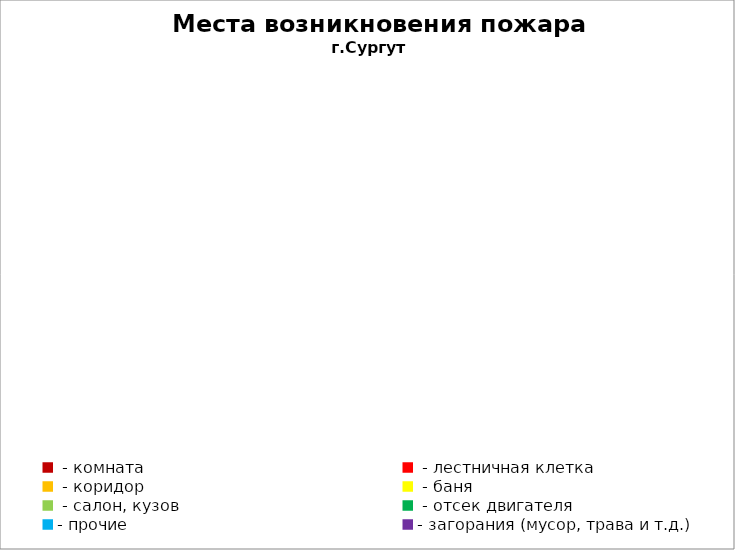
| Category | Места возникновения пожара |
|---|---|
|  - комната | 68 |
|  - лестничная клетка | 27 |
|  - коридор | 12 |
|  - баня | 30 |
|  - салон, кузов | 15 |
|  - отсек двигателя | 56 |
| - прочие | 187 |
| - загорания (мусор, трава и т.д.)  | 185 |